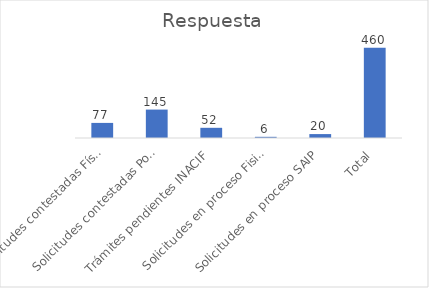
| Category | Respuesta |
|---|---|
| Solicitudes contestadas Físicas | 77 |
| Solicitudes contestadas Portal SAIP | 145 |
| Trámites pendientes INACIF | 52 |
| Solicitudes en proceso Fisicas | 6 |
| Solicitudes en proceso SAIP | 20 |
| Total | 460 |